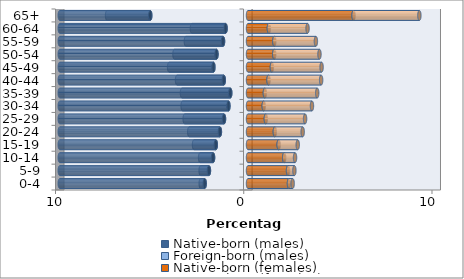
| Category | Native-born (males) | Foreign-born (males) | Native-born (females) | Foreign-born (females) |
|---|---|---|---|---|
| 0-4 | -2.3 | -0.212 | 2.177 | 0.196 |
| 5-9 | -2.075 | -0.441 | 2.126 | 0.338 |
| 10-14 | -1.856 | -0.689 | 1.922 | 0.577 |
| 15-19 | -1.71 | -1.157 | 1.629 | 1.013 |
| 20-24 | -1.492 | -1.63 | 1.426 | 1.479 |
| 25-29 | -1.275 | -2.089 | 0.947 | 2.085 |
| 30-34 | -1.039 | -2.435 | 0.835 | 2.563 |
| 35-39 | -0.942 | -2.566 | 0.896 | 2.781 |
| 40-44 | -1.285 | -2.486 | 1.09 | 2.795 |
| 45-49 | -1.837 | -2.355 | 1.27 | 2.639 |
| 50-54 | -1.674 | -2.232 | 1.394 | 2.402 |
| 55-59 | -1.326 | -1.974 | 1.399 | 2.208 |
| 60-64 | -1.191 | -1.787 | 1.108 | 2.055 |
| 65+ | -5.193 | -2.295 | 5.609 | 3.495 |